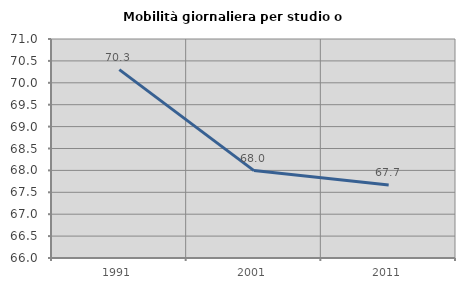
| Category | Mobilità giornaliera per studio o lavoro |
|---|---|
| 1991.0 | 70.3 |
| 2001.0 | 67.995 |
| 2011.0 | 67.668 |